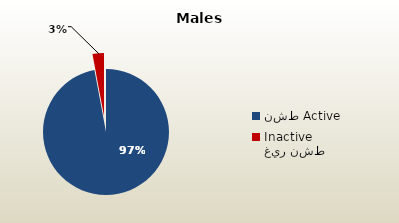
| Category | الذكور غير القطريين  Non-Qatari Males |
|---|---|
| نشط Active | 1671507 |
| غير نشط Inactive | 50658 |